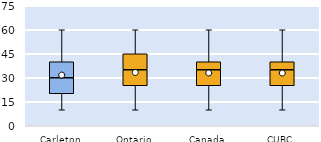
| Category | 25th | 50th | 75th |
|---|---|---|---|
| Carleton | 20 | 10 | 10 |
| Ontario | 25 | 10 | 10 |
| Canada | 25 | 10 | 5 |
| CUBC | 25 | 10 | 5 |